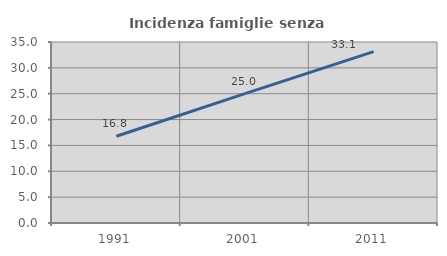
| Category | Incidenza famiglie senza nuclei |
|---|---|
| 1991.0 | 16.78 |
| 2001.0 | 25.01 |
| 2011.0 | 33.148 |